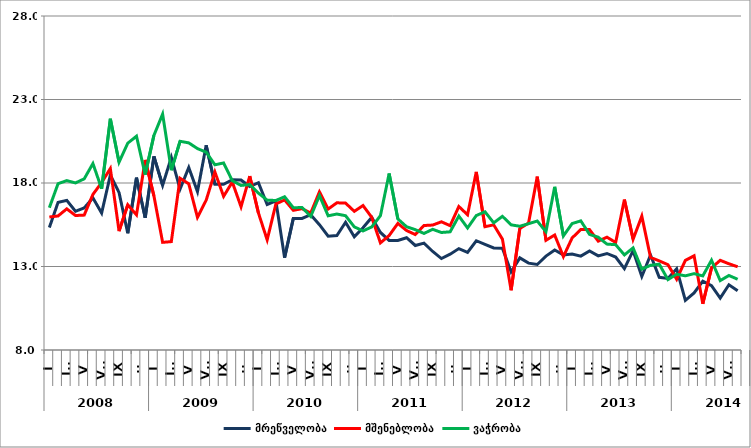
| Category | მრეწველობა | მშენებლობა | ვაჭრობა |
|---|---|---|---|
| 0 | 15.333 | 15.964 | 16.522 |
| 1900-01-01 | 16.84 | 16.027 | 17.96 |
| 1900-01-02 | 16.958 | 16.452 | 18.142 |
| 1900-01-03 | 16.307 | 16.053 | 18.005 |
| 1900-01-04 | 16.507 | 16.077 | 18.249 |
| 1900-01-05 | 17.108 | 17.316 | 19.166 |
| 1900-01-06 | 16.201 | 18.025 | 17.658 |
| 1900-01-07 | 18.475 | 18.866 | 21.849 |
| 1900-01-08 | 17.426 | 15.117 | 19.245 |
| 1900-01-09 | 14.988 | 16.699 | 20.383 |
| 1900-01-10 | 18.321 | 16.088 | 20.802 |
| 1900-01-11 | 15.919 | 19.38 | 18.504 |
| 1900-01-12 | 19.593 | 17.233 | 20.848 |
| 1900-01-13 | 17.859 | 14.447 | 22.127 |
| 1900-01-14 | 19.537 | 14.49 | 18.766 |
| 1900-01-15 | 17.634 | 18.286 | 20.497 |
| 1900-01-16 | 18.929 | 17.952 | 20.404 |
| 1900-01-17 | 17.482 | 15.943 | 20.059 |
| 1900-01-18 | 20.258 | 16.973 | 19.846 |
| 1900-01-19 | 17.92 | 18.659 | 19.09 |
| 1900-01-20 | 17.92 | 17.2 | 19.2 |
| 1900-01-21 | 18.194 | 18.058 | 18.135 |
| 1900-01-22 | 18.183 | 16.576 | 17.855 |
| 1900-01-23 | 17.788 | 18.412 | 17.906 |
| 1900-01-24 | 18.018 | 16.201 | 17.394 |
| 1900-01-25 | 16.714 | 14.594 | 16.974 |
| 1900-01-26 | 16.934 | 16.744 | 16.952 |
| 1900-01-27 | 13.527 | 16.988 | 17.176 |
| 1900-01-28 | 15.88 | 16.364 | 16.521 |
| 1900-01-29 | 15.875 | 16.463 | 16.53 |
| 1900-01-30 | 16.1 | 16.2 | 16 |
| 1900-01-31 | 15.502 | 17.469 | 17.248 |
| 1900-02-01 | 14.816 | 16.442 | 16.035 |
| 1900-02-02 | 14.858 | 16.814 | 16.143 |
| 1900-02-03 | 15.647 | 16.796 | 16.04 |
| 1900-02-04 | 14.78 | 16.304 | 15.375 |
| 1900-02-05 | 15.317 | 16.651 | 15.129 |
| 1900-02-06 | 15.939 | 15.946 | 15.369 |
| 1900-02-07 | 15.037 | 14.415 | 16.043 |
| 1900-02-08 | 14.56 | 14.854 | 18.569 |
| 1900-02-09 | 14.562 | 15.58 | 15.848 |
| 1900-02-10 | 14.723 | 15.154 | 15.381 |
| 1900-02-11 | 14.258 | 14.913 | 15.205 |
| 1900-02-12 | 14.403 | 15.454 | 14.981 |
| 1900-02-13 | 13.901 | 15.482 | 15.226 |
| 1900-02-14 | 13.476 | 15.677 | 15.036 |
| 1900-02-15 | 13.739 | 15.446 | 15.077 |
| 1900-02-16 | 14.072 | 16.592 | 16.019 |
| 1900-02-17 | 13.849 | 16.099 | 15.307 |
| 1900-02-18 | 14.543 | 18.665 | 16.05 |
| 1900-02-19 | 14.325 | 15.382 | 16.277 |
| 1900-02-20 | 14.113 | 15.495 | 15.615 |
| 1900-02-21 | 14.09 | 14.64 | 16.005 |
| 1900-02-22 | 12.674 | 11.577 | 15.494 |
| 1900-02-23 | 13.515 | 15.28 | 15.411 |
| 1900-02-24 | 13.202 | 15.596 | 15.562 |
| 1900-02-25 | 13.121 | 18.381 | 15.723 |
| 1900-02-26 | 13.623 | 14.57 | 15.085 |
| 1900-02-27 | 13.992 | 14.885 | 17.769 |
| 1900-02-28 | 13.695 | 13.592 | 14.83 |
| 1900-02-28 | 13.742 | 14.708 | 15.571 |
| 1900-03-01 | 13.622 | 15.216 | 15.732 |
| 1900-03-02 | 13.928 | 15.209 | 14.923 |
| 1900-03-03 | 13.638 | 14.517 | 14.754 |
| 1900-03-04 | 13.78 | 14.756 | 14.341 |
| 1900-03-05 | 13.564 | 14.438 | 14.307 |
| 1900-03-06 | 12.877 | 17.008 | 13.694 |
| 1900-03-07 | 13.949 | 14.637 | 14.113 |
| 1900-03-08 | 12.398 | 16.018 | 12.841 |
| 1900-03-09 | 13.686 | 13.543 | 13.071 |
| 1900-03-10 | 12.353 | 13.342 | 13.139 |
| 1900-03-11 | 12.281 | 13.106 | 12.215 |
| 1900-03-12 | 12.86 | 12.24 | 12.538 |
| 1900-03-13 | 10.975 | 13.365 | 12.442 |
| 1900-03-14 | 11.413 | 13.639 | 12.572 |
| 1900-03-15 | 12.125 | 10.767 | 12.435 |
| 1900-03-16 | 11.848 | 12.917 | 13.376 |
| 1900-03-17 | 11.103 | 13.37 | 12.155 |
| 1900-03-18 | 11.908 | 13.163 | 12.462 |
| 1900-03-19 | 11.55 | 12.985 | 12.235 |